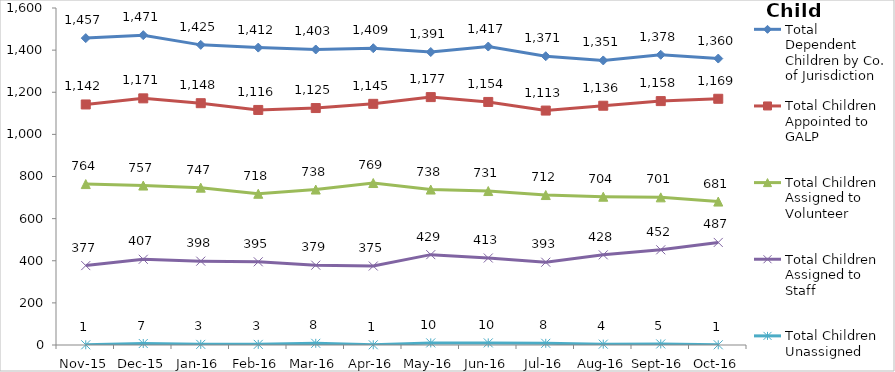
| Category | Total Dependent Children by Co. of Jurisdiction | Total Children Appointed to GALP | Total Children Assigned to Volunteer | Total Children Assigned to Staff | Total Children Unassigned |
|---|---|---|---|---|---|
| Nov-15 | 1457 | 1142 | 764 | 377 | 1 |
| Dec-15 | 1471 | 1171 | 757 | 407 | 7 |
| Jan-16 | 1425 | 1148 | 747 | 398 | 3 |
| Feb-16 | 1412 | 1116 | 718 | 395 | 3 |
| Mar-16 | 1403 | 1125 | 738 | 379 | 8 |
| Apr-16 | 1409 | 1145 | 769 | 375 | 1 |
| May-16 | 1391 | 1177 | 738 | 429 | 10 |
| Jun-16 | 1417 | 1154 | 731 | 413 | 10 |
| Jul-16 | 1371 | 1113 | 712 | 393 | 8 |
| Aug-16 | 1351 | 1136 | 704 | 428 | 4 |
| Sep-16 | 1378 | 1158 | 701 | 452 | 5 |
| Oct-16 | 1360 | 1169 | 681 | 487 | 1 |